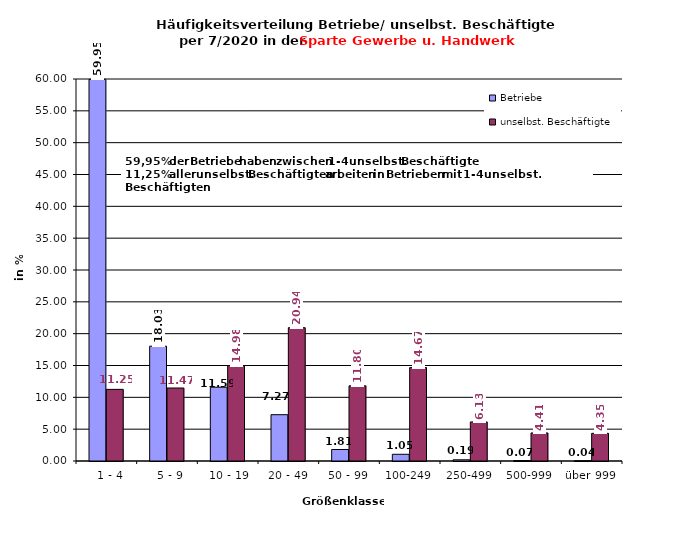
| Category | Betriebe | unselbst. Beschäftigte |
|---|---|---|
|   1 - 4 | 59.948 | 11.252 |
|   5 - 9 | 18.034 | 11.465 |
|  10 - 19 | 11.589 | 14.984 |
| 20 - 49 | 7.274 | 20.939 |
| 50 - 99 | 1.806 | 11.804 |
| 100-249 | 1.054 | 14.67 |
| 250-499 | 0.19 | 6.133 |
| 500-999 | 0.07 | 4.406 |
| über 999 | 0.035 | 4.345 |